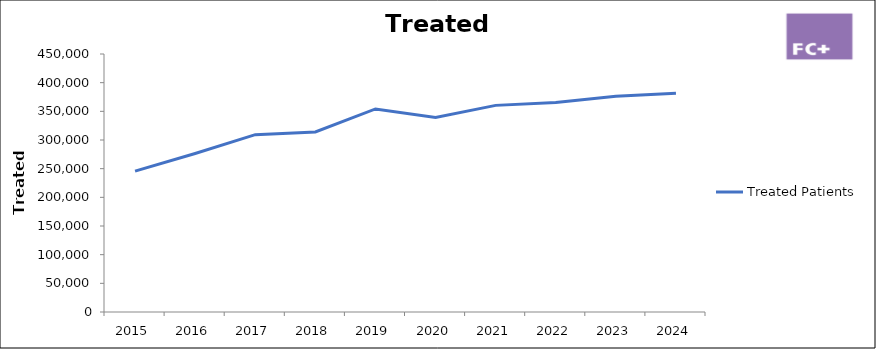
| Category | Treated Patients |
|---|---|
| 2015.0 | 245762.25 |
| 2016.0 | 276368.344 |
| 2017.0 | 309369.749 |
| 2018.0 | 314062.85 |
| 2019.0 | 354173.279 |
| 2020.0 | 339099.813 |
| 2021.0 | 360401.905 |
| 2022.0 | 365556.386 |
| 2023.0 | 376414.111 |
| 2024.0 | 381647.893 |